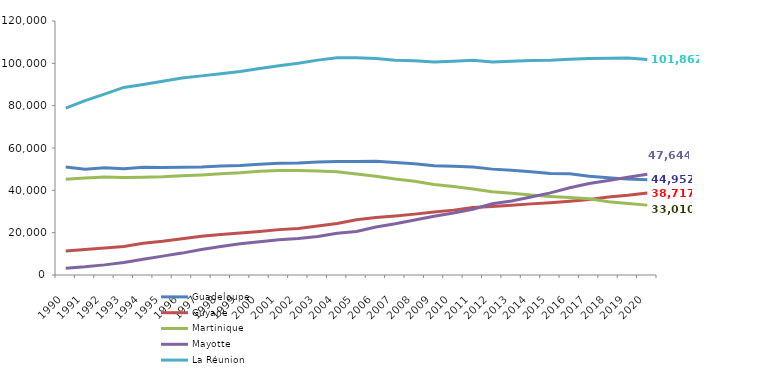
| Category | Guadeloupe | Guyane | Martinique | Mayotte | La Réunion |
|---|---|---|---|---|---|
| 1990.0 | 50994 | 11300 | 45209 | 3239 | 78851 |
| 1991.0 | 49979 | 12058 | 45776 | 3860 | 82411 |
| 1992.0 | 50693 | 12703 | 46322 | 4780 | 85467 |
| 1993.0 | 50174 | 13494 | 46108 | 5946 | 88606 |
| 1994.0 | 50906 | 15034 | 46178 | 7421 | 90045 |
| 1995.0 | 50790 | 15900 | 46383 | 8923 | 91546 |
| 1996.0 | 50878 | 17077 | 46871 | 10345 | 93019 |
| 1997.0 | 51024 | 18291 | 47253 | 12065 | 94072 |
| 1998.0 | 51505 | 19169 | 47785 | 13464 | 95132 |
| 1999.0 | 51711 | 19827 | 48264 | 14735 | 96168 |
| 2000.0 | 52285 | 20585 | 49071 | 15686 | 97550 |
| 2001.0 | 52788 | 21439 | 49415 | 16610 | 98848 |
| 2002.0 | 52926 | 22003 | 49426 | 17258 | 100020 |
| 2003.0 | 53374 | 23198 | 49082 | 18177 | 101522 |
| 2004.0 | 53672 | 24345 | 48729 | 19712 | 102592 |
| 2005.0 | 53668 | 26091 | 47683 | 20600 | 102613 |
| 2006.0 | 53787 | 27190 | 46700 | 22657 | 102233 |
| 2007.0 | 53168 | 27930 | 45348 | 24180 | 101480 |
| 2008.0 | 52547 | 28758 | 44277 | 26006 | 101262 |
| 2009.0 | 51580 | 29750 | 42740 | 27798 | 100635 |
| 2010.0 | 51331 | 30648 | 41785 | 29254 | 100995 |
| 2011.0 | 51010 | 31904 | 40673 | 31094 | 101457 |
| 2012.0 | 50019 | 32371 | 39362 | 33646 | 100611 |
| 2013.0 | 49491 | 32966 | 38615 | 34996 | 101015 |
| 2014.0 | 48797 | 33603 | 37765 | 36830 | 101338 |
| 2015.0 | 47969 | 34154 | 37120 | 38795 | 101504 |
| 2016.0 | 47777 | 34848 | 36640 | 41244 | 101983 |
| 2017.0 | 46709 | 35714 | 36000 | 43229 | 102292 |
| 2018.0 | 45995 | 36810 | 34606 | 44633 | 102390 |
| 2019.0 | 45296 | 37646 | 33794 | 46136 | 102519 |
| 2020.0 | 44952 | 38717 | 33010 | 47644 | 101862 |